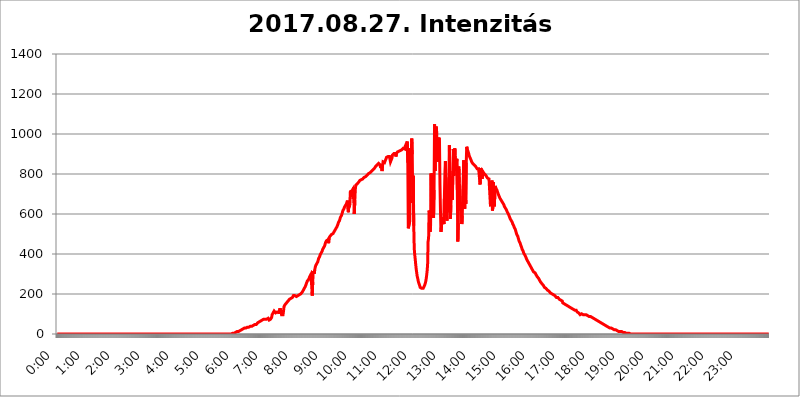
| Category | 2017.08.27. Intenzitás [W/m^2] |
|---|---|
| 0.0 | 0 |
| 0.0006944444444444445 | 0 |
| 0.001388888888888889 | 0 |
| 0.0020833333333333333 | 0 |
| 0.002777777777777778 | 0 |
| 0.003472222222222222 | 0 |
| 0.004166666666666667 | 0 |
| 0.004861111111111111 | 0 |
| 0.005555555555555556 | 0 |
| 0.0062499999999999995 | 0 |
| 0.006944444444444444 | 0 |
| 0.007638888888888889 | 0 |
| 0.008333333333333333 | 0 |
| 0.009027777777777779 | 0 |
| 0.009722222222222222 | 0 |
| 0.010416666666666666 | 0 |
| 0.011111111111111112 | 0 |
| 0.011805555555555555 | 0 |
| 0.012499999999999999 | 0 |
| 0.013194444444444444 | 0 |
| 0.013888888888888888 | 0 |
| 0.014583333333333332 | 0 |
| 0.015277777777777777 | 0 |
| 0.015972222222222224 | 0 |
| 0.016666666666666666 | 0 |
| 0.017361111111111112 | 0 |
| 0.018055555555555557 | 0 |
| 0.01875 | 0 |
| 0.019444444444444445 | 0 |
| 0.02013888888888889 | 0 |
| 0.020833333333333332 | 0 |
| 0.02152777777777778 | 0 |
| 0.022222222222222223 | 0 |
| 0.02291666666666667 | 0 |
| 0.02361111111111111 | 0 |
| 0.024305555555555556 | 0 |
| 0.024999999999999998 | 0 |
| 0.025694444444444447 | 0 |
| 0.02638888888888889 | 0 |
| 0.027083333333333334 | 0 |
| 0.027777777777777776 | 0 |
| 0.02847222222222222 | 0 |
| 0.029166666666666664 | 0 |
| 0.029861111111111113 | 0 |
| 0.030555555555555555 | 0 |
| 0.03125 | 0 |
| 0.03194444444444445 | 0 |
| 0.03263888888888889 | 0 |
| 0.03333333333333333 | 0 |
| 0.034027777777777775 | 0 |
| 0.034722222222222224 | 0 |
| 0.035416666666666666 | 0 |
| 0.036111111111111115 | 0 |
| 0.03680555555555556 | 0 |
| 0.0375 | 0 |
| 0.03819444444444444 | 0 |
| 0.03888888888888889 | 0 |
| 0.03958333333333333 | 0 |
| 0.04027777777777778 | 0 |
| 0.04097222222222222 | 0 |
| 0.041666666666666664 | 0 |
| 0.042361111111111106 | 0 |
| 0.04305555555555556 | 0 |
| 0.043750000000000004 | 0 |
| 0.044444444444444446 | 0 |
| 0.04513888888888889 | 0 |
| 0.04583333333333334 | 0 |
| 0.04652777777777778 | 0 |
| 0.04722222222222222 | 0 |
| 0.04791666666666666 | 0 |
| 0.04861111111111111 | 0 |
| 0.049305555555555554 | 0 |
| 0.049999999999999996 | 0 |
| 0.05069444444444445 | 0 |
| 0.051388888888888894 | 0 |
| 0.052083333333333336 | 0 |
| 0.05277777777777778 | 0 |
| 0.05347222222222222 | 0 |
| 0.05416666666666667 | 0 |
| 0.05486111111111111 | 0 |
| 0.05555555555555555 | 0 |
| 0.05625 | 0 |
| 0.05694444444444444 | 0 |
| 0.057638888888888885 | 0 |
| 0.05833333333333333 | 0 |
| 0.05902777777777778 | 0 |
| 0.059722222222222225 | 0 |
| 0.06041666666666667 | 0 |
| 0.061111111111111116 | 0 |
| 0.06180555555555556 | 0 |
| 0.0625 | 0 |
| 0.06319444444444444 | 0 |
| 0.06388888888888888 | 0 |
| 0.06458333333333334 | 0 |
| 0.06527777777777778 | 0 |
| 0.06597222222222222 | 0 |
| 0.06666666666666667 | 0 |
| 0.06736111111111111 | 0 |
| 0.06805555555555555 | 0 |
| 0.06874999999999999 | 0 |
| 0.06944444444444443 | 0 |
| 0.07013888888888889 | 0 |
| 0.07083333333333333 | 0 |
| 0.07152777777777779 | 0 |
| 0.07222222222222223 | 0 |
| 0.07291666666666667 | 0 |
| 0.07361111111111111 | 0 |
| 0.07430555555555556 | 0 |
| 0.075 | 0 |
| 0.07569444444444444 | 0 |
| 0.0763888888888889 | 0 |
| 0.07708333333333334 | 0 |
| 0.07777777777777778 | 0 |
| 0.07847222222222222 | 0 |
| 0.07916666666666666 | 0 |
| 0.0798611111111111 | 0 |
| 0.08055555555555556 | 0 |
| 0.08125 | 0 |
| 0.08194444444444444 | 0 |
| 0.08263888888888889 | 0 |
| 0.08333333333333333 | 0 |
| 0.08402777777777777 | 0 |
| 0.08472222222222221 | 0 |
| 0.08541666666666665 | 0 |
| 0.08611111111111112 | 0 |
| 0.08680555555555557 | 0 |
| 0.08750000000000001 | 0 |
| 0.08819444444444445 | 0 |
| 0.08888888888888889 | 0 |
| 0.08958333333333333 | 0 |
| 0.09027777777777778 | 0 |
| 0.09097222222222222 | 0 |
| 0.09166666666666667 | 0 |
| 0.09236111111111112 | 0 |
| 0.09305555555555556 | 0 |
| 0.09375 | 0 |
| 0.09444444444444444 | 0 |
| 0.09513888888888888 | 0 |
| 0.09583333333333333 | 0 |
| 0.09652777777777777 | 0 |
| 0.09722222222222222 | 0 |
| 0.09791666666666667 | 0 |
| 0.09861111111111111 | 0 |
| 0.09930555555555555 | 0 |
| 0.09999999999999999 | 0 |
| 0.10069444444444443 | 0 |
| 0.1013888888888889 | 0 |
| 0.10208333333333335 | 0 |
| 0.10277777777777779 | 0 |
| 0.10347222222222223 | 0 |
| 0.10416666666666667 | 0 |
| 0.10486111111111111 | 0 |
| 0.10555555555555556 | 0 |
| 0.10625 | 0 |
| 0.10694444444444444 | 0 |
| 0.1076388888888889 | 0 |
| 0.10833333333333334 | 0 |
| 0.10902777777777778 | 0 |
| 0.10972222222222222 | 0 |
| 0.1111111111111111 | 0 |
| 0.11180555555555556 | 0 |
| 0.11180555555555556 | 0 |
| 0.1125 | 0 |
| 0.11319444444444444 | 0 |
| 0.11388888888888889 | 0 |
| 0.11458333333333333 | 0 |
| 0.11527777777777777 | 0 |
| 0.11597222222222221 | 0 |
| 0.11666666666666665 | 0 |
| 0.1173611111111111 | 0 |
| 0.11805555555555557 | 0 |
| 0.11944444444444445 | 0 |
| 0.12013888888888889 | 0 |
| 0.12083333333333333 | 0 |
| 0.12152777777777778 | 0 |
| 0.12222222222222223 | 0 |
| 0.12291666666666667 | 0 |
| 0.12291666666666667 | 0 |
| 0.12361111111111112 | 0 |
| 0.12430555555555556 | 0 |
| 0.125 | 0 |
| 0.12569444444444444 | 0 |
| 0.12638888888888888 | 0 |
| 0.12708333333333333 | 0 |
| 0.16875 | 0 |
| 0.12847222222222224 | 0 |
| 0.12916666666666668 | 0 |
| 0.12986111111111112 | 0 |
| 0.13055555555555556 | 0 |
| 0.13125 | 0 |
| 0.13194444444444445 | 0 |
| 0.1326388888888889 | 0 |
| 0.13333333333333333 | 0 |
| 0.13402777777777777 | 0 |
| 0.13402777777777777 | 0 |
| 0.13472222222222222 | 0 |
| 0.13541666666666666 | 0 |
| 0.1361111111111111 | 0 |
| 0.13749999999999998 | 0 |
| 0.13819444444444443 | 0 |
| 0.1388888888888889 | 0 |
| 0.13958333333333334 | 0 |
| 0.14027777777777778 | 0 |
| 0.14097222222222222 | 0 |
| 0.14166666666666666 | 0 |
| 0.1423611111111111 | 0 |
| 0.14305555555555557 | 0 |
| 0.14375000000000002 | 0 |
| 0.14444444444444446 | 0 |
| 0.1451388888888889 | 0 |
| 0.1451388888888889 | 0 |
| 0.14652777777777778 | 0 |
| 0.14722222222222223 | 0 |
| 0.14791666666666667 | 0 |
| 0.1486111111111111 | 0 |
| 0.14930555555555555 | 0 |
| 0.15 | 0 |
| 0.15069444444444444 | 0 |
| 0.15138888888888888 | 0 |
| 0.15208333333333332 | 0 |
| 0.15277777777777776 | 0 |
| 0.15347222222222223 | 0 |
| 0.15416666666666667 | 0 |
| 0.15486111111111112 | 0 |
| 0.15555555555555556 | 0 |
| 0.15625 | 0 |
| 0.15694444444444444 | 0 |
| 0.15763888888888888 | 0 |
| 0.15833333333333333 | 0 |
| 0.15902777777777777 | 0 |
| 0.15972222222222224 | 0 |
| 0.16041666666666668 | 0 |
| 0.16111111111111112 | 0 |
| 0.16180555555555556 | 0 |
| 0.1625 | 0 |
| 0.16319444444444445 | 0 |
| 0.1638888888888889 | 0 |
| 0.16458333333333333 | 0 |
| 0.16527777777777777 | 0 |
| 0.16597222222222222 | 0 |
| 0.16666666666666666 | 0 |
| 0.1673611111111111 | 0 |
| 0.16805555555555554 | 0 |
| 0.16874999999999998 | 0 |
| 0.16944444444444443 | 0 |
| 0.17013888888888887 | 0 |
| 0.1708333333333333 | 0 |
| 0.17152777777777775 | 0 |
| 0.17222222222222225 | 0 |
| 0.1729166666666667 | 0 |
| 0.17361111111111113 | 0 |
| 0.17430555555555557 | 0 |
| 0.17500000000000002 | 0 |
| 0.17569444444444446 | 0 |
| 0.1763888888888889 | 0 |
| 0.17708333333333334 | 0 |
| 0.17777777777777778 | 0 |
| 0.17847222222222223 | 0 |
| 0.17916666666666667 | 0 |
| 0.1798611111111111 | 0 |
| 0.18055555555555555 | 0 |
| 0.18125 | 0 |
| 0.18194444444444444 | 0 |
| 0.1826388888888889 | 0 |
| 0.18333333333333335 | 0 |
| 0.1840277777777778 | 0 |
| 0.18472222222222223 | 0 |
| 0.18541666666666667 | 0 |
| 0.18611111111111112 | 0 |
| 0.18680555555555556 | 0 |
| 0.1875 | 0 |
| 0.18819444444444444 | 0 |
| 0.18888888888888888 | 0 |
| 0.18958333333333333 | 0 |
| 0.19027777777777777 | 0 |
| 0.1909722222222222 | 0 |
| 0.19166666666666665 | 0 |
| 0.19236111111111112 | 0 |
| 0.19305555555555554 | 0 |
| 0.19375 | 0 |
| 0.19444444444444445 | 0 |
| 0.1951388888888889 | 0 |
| 0.19583333333333333 | 0 |
| 0.19652777777777777 | 0 |
| 0.19722222222222222 | 0 |
| 0.19791666666666666 | 0 |
| 0.1986111111111111 | 0 |
| 0.19930555555555554 | 0 |
| 0.19999999999999998 | 0 |
| 0.20069444444444443 | 0 |
| 0.20138888888888887 | 0 |
| 0.2020833333333333 | 0 |
| 0.2027777777777778 | 0 |
| 0.2034722222222222 | 0 |
| 0.2041666666666667 | 0 |
| 0.20486111111111113 | 0 |
| 0.20555555555555557 | 0 |
| 0.20625000000000002 | 0 |
| 0.20694444444444446 | 0 |
| 0.2076388888888889 | 0 |
| 0.20833333333333334 | 0 |
| 0.20902777777777778 | 0 |
| 0.20972222222222223 | 0 |
| 0.21041666666666667 | 0 |
| 0.2111111111111111 | 0 |
| 0.21180555555555555 | 0 |
| 0.2125 | 0 |
| 0.21319444444444444 | 0 |
| 0.2138888888888889 | 0 |
| 0.21458333333333335 | 0 |
| 0.2152777777777778 | 0 |
| 0.21597222222222223 | 0 |
| 0.21666666666666667 | 0 |
| 0.21736111111111112 | 0 |
| 0.21805555555555556 | 0 |
| 0.21875 | 0 |
| 0.21944444444444444 | 0 |
| 0.22013888888888888 | 0 |
| 0.22083333333333333 | 0 |
| 0.22152777777777777 | 0 |
| 0.2222222222222222 | 0 |
| 0.22291666666666665 | 0 |
| 0.2236111111111111 | 0 |
| 0.22430555555555556 | 0 |
| 0.225 | 0 |
| 0.22569444444444445 | 0 |
| 0.2263888888888889 | 0 |
| 0.22708333333333333 | 0 |
| 0.22777777777777777 | 0 |
| 0.22847222222222222 | 0 |
| 0.22916666666666666 | 0 |
| 0.2298611111111111 | 0 |
| 0.23055555555555554 | 0 |
| 0.23124999999999998 | 0 |
| 0.23194444444444443 | 0 |
| 0.23263888888888887 | 0 |
| 0.2333333333333333 | 0 |
| 0.2340277777777778 | 0 |
| 0.2347222222222222 | 0 |
| 0.2354166666666667 | 0 |
| 0.23611111111111113 | 0 |
| 0.23680555555555557 | 0 |
| 0.23750000000000002 | 0 |
| 0.23819444444444446 | 0 |
| 0.2388888888888889 | 0 |
| 0.23958333333333334 | 0 |
| 0.24027777777777778 | 0 |
| 0.24097222222222223 | 0 |
| 0.24166666666666667 | 0 |
| 0.2423611111111111 | 0 |
| 0.24305555555555555 | 0 |
| 0.24375 | 0 |
| 0.24444444444444446 | 0 |
| 0.24513888888888888 | 0 |
| 0.24583333333333335 | 3.525 |
| 0.2465277777777778 | 3.525 |
| 0.24722222222222223 | 3.525 |
| 0.24791666666666667 | 3.525 |
| 0.24861111111111112 | 3.525 |
| 0.24930555555555556 | 3.525 |
| 0.25 | 7.887 |
| 0.25069444444444444 | 7.887 |
| 0.2513888888888889 | 7.887 |
| 0.2520833333333333 | 12.257 |
| 0.25277777777777777 | 12.257 |
| 0.2534722222222222 | 12.257 |
| 0.25416666666666665 | 12.257 |
| 0.2548611111111111 | 12.257 |
| 0.2555555555555556 | 16.636 |
| 0.25625000000000003 | 16.636 |
| 0.2569444444444445 | 16.636 |
| 0.2576388888888889 | 21.024 |
| 0.25833333333333336 | 21.024 |
| 0.2590277777777778 | 21.024 |
| 0.25972222222222224 | 21.024 |
| 0.2604166666666667 | 25.419 |
| 0.2611111111111111 | 25.419 |
| 0.26180555555555557 | 25.419 |
| 0.2625 | 29.823 |
| 0.26319444444444445 | 29.823 |
| 0.2638888888888889 | 29.823 |
| 0.26458333333333334 | 29.823 |
| 0.2652777777777778 | 29.823 |
| 0.2659722222222222 | 34.234 |
| 0.26666666666666666 | 34.234 |
| 0.2673611111111111 | 34.234 |
| 0.26805555555555555 | 34.234 |
| 0.26875 | 34.234 |
| 0.26944444444444443 | 34.234 |
| 0.2701388888888889 | 34.234 |
| 0.2708333333333333 | 38.653 |
| 0.27152777777777776 | 38.653 |
| 0.2722222222222222 | 38.653 |
| 0.27291666666666664 | 38.653 |
| 0.2736111111111111 | 38.653 |
| 0.2743055555555555 | 38.653 |
| 0.27499999999999997 | 43.079 |
| 0.27569444444444446 | 43.079 |
| 0.27638888888888885 | 47.511 |
| 0.27708333333333335 | 47.511 |
| 0.2777777777777778 | 47.511 |
| 0.27847222222222223 | 47.511 |
| 0.2791666666666667 | 47.511 |
| 0.2798611111111111 | 51.951 |
| 0.28055555555555556 | 51.951 |
| 0.28125 | 56.398 |
| 0.28194444444444444 | 56.398 |
| 0.2826388888888889 | 56.398 |
| 0.2833333333333333 | 60.85 |
| 0.28402777777777777 | 60.85 |
| 0.2847222222222222 | 65.31 |
| 0.28541666666666665 | 65.31 |
| 0.28611111111111115 | 65.31 |
| 0.28680555555555554 | 69.775 |
| 0.28750000000000003 | 69.775 |
| 0.2881944444444445 | 69.775 |
| 0.2888888888888889 | 74.246 |
| 0.28958333333333336 | 74.246 |
| 0.2902777777777778 | 74.246 |
| 0.29097222222222224 | 74.246 |
| 0.2916666666666667 | 74.246 |
| 0.2923611111111111 | 74.246 |
| 0.29305555555555557 | 74.246 |
| 0.29375 | 74.246 |
| 0.29444444444444445 | 78.722 |
| 0.2951388888888889 | 78.722 |
| 0.29583333333333334 | 78.722 |
| 0.2965277777777778 | 74.246 |
| 0.2972222222222222 | 69.775 |
| 0.29791666666666666 | 74.246 |
| 0.2986111111111111 | 74.246 |
| 0.29930555555555555 | 74.246 |
| 0.3 | 78.722 |
| 0.30069444444444443 | 83.205 |
| 0.3013888888888889 | 96.682 |
| 0.3020833333333333 | 101.184 |
| 0.30277777777777776 | 105.69 |
| 0.3034722222222222 | 110.201 |
| 0.30416666666666664 | 114.716 |
| 0.3048611111111111 | 114.716 |
| 0.3055555555555555 | 114.716 |
| 0.30624999999999997 | 105.69 |
| 0.3069444444444444 | 105.69 |
| 0.3076388888888889 | 105.69 |
| 0.30833333333333335 | 110.201 |
| 0.3090277777777778 | 114.716 |
| 0.30972222222222223 | 110.201 |
| 0.3104166666666667 | 110.201 |
| 0.3111111111111111 | 101.184 |
| 0.31180555555555556 | 101.184 |
| 0.3125 | 128.284 |
| 0.31319444444444444 | 123.758 |
| 0.3138888888888889 | 110.201 |
| 0.3145833333333333 | 96.682 |
| 0.31527777777777777 | 101.184 |
| 0.3159722222222222 | 96.682 |
| 0.31666666666666665 | 96.682 |
| 0.31736111111111115 | 114.716 |
| 0.31805555555555554 | 137.347 |
| 0.31875000000000003 | 141.884 |
| 0.3194444444444445 | 146.423 |
| 0.3201388888888889 | 146.423 |
| 0.32083333333333336 | 150.964 |
| 0.3215277777777778 | 155.509 |
| 0.32222222222222224 | 155.509 |
| 0.3229166666666667 | 160.056 |
| 0.3236111111111111 | 164.605 |
| 0.32430555555555557 | 164.605 |
| 0.325 | 164.605 |
| 0.32569444444444445 | 173.709 |
| 0.3263888888888889 | 173.709 |
| 0.32708333333333334 | 178.264 |
| 0.3277777777777778 | 178.264 |
| 0.3284722222222222 | 178.264 |
| 0.32916666666666666 | 182.82 |
| 0.3298611111111111 | 182.82 |
| 0.33055555555555555 | 187.378 |
| 0.33125 | 191.937 |
| 0.33194444444444443 | 191.937 |
| 0.3326388888888889 | 191.937 |
| 0.3333333333333333 | 191.937 |
| 0.3340277777777778 | 191.937 |
| 0.3347222222222222 | 187.378 |
| 0.3354166666666667 | 187.378 |
| 0.3361111111111111 | 187.378 |
| 0.3368055555555556 | 187.378 |
| 0.33749999999999997 | 191.937 |
| 0.33819444444444446 | 196.497 |
| 0.33888888888888885 | 196.497 |
| 0.33958333333333335 | 196.497 |
| 0.34027777777777773 | 196.497 |
| 0.34097222222222223 | 196.497 |
| 0.3416666666666666 | 201.058 |
| 0.3423611111111111 | 201.058 |
| 0.3430555555555555 | 205.62 |
| 0.34375 | 210.182 |
| 0.3444444444444445 | 210.182 |
| 0.3451388888888889 | 219.309 |
| 0.3458333333333334 | 223.873 |
| 0.34652777777777777 | 228.436 |
| 0.34722222222222227 | 233 |
| 0.34791666666666665 | 237.564 |
| 0.34861111111111115 | 242.127 |
| 0.34930555555555554 | 251.251 |
| 0.35000000000000003 | 255.813 |
| 0.3506944444444444 | 264.932 |
| 0.3513888888888889 | 269.49 |
| 0.3520833333333333 | 269.49 |
| 0.3527777777777778 | 274.047 |
| 0.3534722222222222 | 278.603 |
| 0.3541666666666667 | 287.709 |
| 0.3548611111111111 | 292.259 |
| 0.35555555555555557 | 296.808 |
| 0.35625 | 292.259 |
| 0.35694444444444445 | 237.564 |
| 0.3576388888888889 | 191.937 |
| 0.35833333333333334 | 260.373 |
| 0.3590277777777778 | 314.98 |
| 0.3597222222222222 | 310.44 |
| 0.36041666666666666 | 301.354 |
| 0.3611111111111111 | 319.517 |
| 0.36180555555555555 | 333.113 |
| 0.3625 | 342.162 |
| 0.36319444444444443 | 346.682 |
| 0.3638888888888889 | 351.198 |
| 0.3645833333333333 | 355.712 |
| 0.3652777777777778 | 360.221 |
| 0.3659722222222222 | 369.23 |
| 0.3666666666666667 | 378.224 |
| 0.3673611111111111 | 378.224 |
| 0.3680555555555556 | 387.202 |
| 0.36874999999999997 | 396.164 |
| 0.36944444444444446 | 396.164 |
| 0.37013888888888885 | 405.108 |
| 0.37083333333333335 | 409.574 |
| 0.37152777777777773 | 414.035 |
| 0.37222222222222223 | 422.943 |
| 0.3729166666666666 | 427.39 |
| 0.3736111111111111 | 431.833 |
| 0.3743055555555555 | 436.27 |
| 0.375 | 440.702 |
| 0.3756944444444445 | 449.551 |
| 0.3763888888888889 | 458.38 |
| 0.3770833333333334 | 462.786 |
| 0.37777777777777777 | 467.187 |
| 0.37847222222222227 | 471.582 |
| 0.37916666666666665 | 471.582 |
| 0.37986111111111115 | 471.582 |
| 0.38055555555555554 | 453.968 |
| 0.38125000000000003 | 480.356 |
| 0.3819444444444444 | 484.735 |
| 0.3826388888888889 | 489.108 |
| 0.3833333333333333 | 489.108 |
| 0.3840277777777778 | 493.475 |
| 0.3847222222222222 | 497.836 |
| 0.3854166666666667 | 497.836 |
| 0.3861111111111111 | 502.192 |
| 0.38680555555555557 | 502.192 |
| 0.3875 | 506.542 |
| 0.38819444444444445 | 510.885 |
| 0.3888888888888889 | 515.223 |
| 0.38958333333333334 | 519.555 |
| 0.3902777777777778 | 523.88 |
| 0.3909722222222222 | 528.2 |
| 0.39166666666666666 | 532.513 |
| 0.3923611111111111 | 536.82 |
| 0.39305555555555555 | 541.121 |
| 0.39375 | 549.704 |
| 0.39444444444444443 | 558.261 |
| 0.3951388888888889 | 562.53 |
| 0.3958333333333333 | 566.793 |
| 0.3965277777777778 | 575.299 |
| 0.3972222222222222 | 583.779 |
| 0.3979166666666667 | 588.009 |
| 0.3986111111111111 | 592.233 |
| 0.3993055555555556 | 600.661 |
| 0.39999999999999997 | 609.062 |
| 0.40069444444444446 | 617.436 |
| 0.40138888888888885 | 621.613 |
| 0.40208333333333335 | 625.784 |
| 0.40277777777777773 | 634.105 |
| 0.40347222222222223 | 638.256 |
| 0.4041666666666666 | 642.4 |
| 0.4048611111111111 | 642.4 |
| 0.4055555555555555 | 650.667 |
| 0.40625 | 654.791 |
| 0.4069444444444445 | 667.123 |
| 0.4076388888888889 | 671.22 |
| 0.4083333333333334 | 609.062 |
| 0.40902777777777777 | 646.537 |
| 0.40972222222222227 | 634.105 |
| 0.41041666666666665 | 654.791 |
| 0.41111111111111115 | 711.832 |
| 0.41180555555555554 | 711.832 |
| 0.41250000000000003 | 715.858 |
| 0.4131944444444444 | 715.858 |
| 0.4138888888888889 | 719.877 |
| 0.4145833333333333 | 723.889 |
| 0.4152777777777778 | 675.311 |
| 0.4159722222222222 | 731.896 |
| 0.4166666666666667 | 600.661 |
| 0.4173611111111111 | 671.22 |
| 0.41805555555555557 | 723.889 |
| 0.41875 | 743.859 |
| 0.41944444444444445 | 743.859 |
| 0.4201388888888889 | 747.834 |
| 0.42083333333333334 | 751.803 |
| 0.4215277777777778 | 755.766 |
| 0.4222222222222222 | 755.766 |
| 0.42291666666666666 | 759.723 |
| 0.4236111111111111 | 763.674 |
| 0.42430555555555555 | 767.62 |
| 0.425 | 771.559 |
| 0.42569444444444443 | 771.559 |
| 0.4263888888888889 | 771.559 |
| 0.4270833333333333 | 775.492 |
| 0.4277777777777778 | 775.492 |
| 0.4284722222222222 | 775.492 |
| 0.4291666666666667 | 779.42 |
| 0.4298611111111111 | 779.42 |
| 0.4305555555555556 | 783.342 |
| 0.43124999999999997 | 783.342 |
| 0.43194444444444446 | 787.258 |
| 0.43263888888888885 | 787.258 |
| 0.43333333333333335 | 791.169 |
| 0.43402777777777773 | 791.169 |
| 0.43472222222222223 | 795.074 |
| 0.4354166666666666 | 798.974 |
| 0.4361111111111111 | 798.974 |
| 0.4368055555555555 | 802.868 |
| 0.4375 | 806.757 |
| 0.4381944444444445 | 806.757 |
| 0.4388888888888889 | 806.757 |
| 0.4395833333333334 | 810.641 |
| 0.44027777777777777 | 810.641 |
| 0.44097222222222227 | 814.519 |
| 0.44166666666666665 | 818.392 |
| 0.44236111111111115 | 818.392 |
| 0.44305555555555554 | 822.26 |
| 0.44375000000000003 | 826.123 |
| 0.4444444444444444 | 826.123 |
| 0.4451388888888889 | 829.981 |
| 0.4458333333333333 | 833.834 |
| 0.4465277777777778 | 837.682 |
| 0.4472222222222222 | 841.526 |
| 0.4479166666666667 | 841.526 |
| 0.4486111111111111 | 845.365 |
| 0.44930555555555557 | 845.365 |
| 0.45 | 849.199 |
| 0.45069444444444445 | 853.029 |
| 0.4513888888888889 | 853.029 |
| 0.45208333333333334 | 853.029 |
| 0.4527777777777778 | 845.365 |
| 0.4534722222222222 | 829.981 |
| 0.45416666666666666 | 849.199 |
| 0.4548611111111111 | 829.981 |
| 0.45555555555555555 | 814.519 |
| 0.45625 | 841.526 |
| 0.45694444444444443 | 860.676 |
| 0.4576388888888889 | 860.676 |
| 0.4583333333333333 | 864.493 |
| 0.4590277777777778 | 856.855 |
| 0.4597222222222222 | 864.493 |
| 0.4604166666666667 | 868.305 |
| 0.4611111111111111 | 875.918 |
| 0.4618055555555556 | 883.516 |
| 0.46249999999999997 | 883.516 |
| 0.46319444444444446 | 887.309 |
| 0.46388888888888885 | 887.309 |
| 0.46458333333333335 | 887.309 |
| 0.46527777777777773 | 887.309 |
| 0.46597222222222223 | 887.309 |
| 0.4666666666666666 | 891.099 |
| 0.4673611111111111 | 860.676 |
| 0.4680555555555555 | 860.676 |
| 0.46875 | 860.676 |
| 0.4694444444444445 | 879.719 |
| 0.4701388888888889 | 894.885 |
| 0.4708333333333334 | 894.885 |
| 0.47152777777777777 | 898.668 |
| 0.47222222222222227 | 902.447 |
| 0.47291666666666665 | 902.447 |
| 0.47361111111111115 | 902.447 |
| 0.47430555555555554 | 902.447 |
| 0.47500000000000003 | 887.309 |
| 0.4756944444444444 | 902.447 |
| 0.4763888888888889 | 906.223 |
| 0.4770833333333333 | 909.996 |
| 0.4777777777777778 | 909.996 |
| 0.4784722222222222 | 909.996 |
| 0.4791666666666667 | 913.766 |
| 0.4798611111111111 | 917.534 |
| 0.48055555555555557 | 917.534 |
| 0.48125 | 917.534 |
| 0.48194444444444445 | 921.298 |
| 0.4826388888888889 | 921.298 |
| 0.48333333333333334 | 921.298 |
| 0.4840277777777778 | 925.06 |
| 0.4847222222222222 | 917.534 |
| 0.48541666666666666 | 928.819 |
| 0.4861111111111111 | 928.819 |
| 0.48680555555555555 | 925.06 |
| 0.4875 | 925.06 |
| 0.48819444444444443 | 940.082 |
| 0.4888888888888889 | 943.832 |
| 0.4895833333333333 | 951.327 |
| 0.4902777777777778 | 947.58 |
| 0.4909722222222222 | 962.555 |
| 0.4916666666666667 | 856.855 |
| 0.4923611111111111 | 528.2 |
| 0.4930555555555556 | 528.2 |
| 0.49374999999999997 | 528.2 |
| 0.49444444444444446 | 566.793 |
| 0.49513888888888885 | 928.819 |
| 0.49583333333333335 | 860.676 |
| 0.49652777777777773 | 883.516 |
| 0.49722222222222223 | 977.508 |
| 0.4979166666666666 | 898.668 |
| 0.4986111111111111 | 654.791 |
| 0.4993055555555555 | 791.169 |
| 0.5 | 541.121 |
| 0.5006944444444444 | 427.39 |
| 0.5013888888888889 | 396.164 |
| 0.5020833333333333 | 373.729 |
| 0.5027777777777778 | 346.682 |
| 0.5034722222222222 | 324.052 |
| 0.5041666666666667 | 305.898 |
| 0.5048611111111111 | 287.709 |
| 0.5055555555555555 | 278.603 |
| 0.50625 | 264.932 |
| 0.5069444444444444 | 255.813 |
| 0.5076388888888889 | 251.251 |
| 0.5083333333333333 | 242.127 |
| 0.5090277777777777 | 233 |
| 0.5097222222222222 | 233 |
| 0.5104166666666666 | 228.436 |
| 0.5111111111111112 | 228.436 |
| 0.5118055555555555 | 228.436 |
| 0.5125000000000001 | 228.436 |
| 0.5131944444444444 | 228.436 |
| 0.513888888888889 | 233 |
| 0.5145833333333333 | 237.564 |
| 0.5152777777777778 | 242.127 |
| 0.5159722222222222 | 251.251 |
| 0.5166666666666667 | 260.373 |
| 0.517361111111111 | 274.047 |
| 0.5180555555555556 | 292.259 |
| 0.5187499999999999 | 314.98 |
| 0.5194444444444445 | 346.682 |
| 0.5201388888888888 | 462.786 |
| 0.5208333333333334 | 480.356 |
| 0.5215277777777778 | 617.436 |
| 0.5222222222222223 | 609.062 |
| 0.5229166666666667 | 510.885 |
| 0.5236111111111111 | 541.121 |
| 0.5243055555555556 | 802.868 |
| 0.525 | 600.661 |
| 0.5256944444444445 | 683.473 |
| 0.5263888888888889 | 802.868 |
| 0.5270833333333333 | 715.858 |
| 0.5277777777777778 | 579.542 |
| 0.5284722222222222 | 719.877 |
| 0.5291666666666667 | 1048.508 |
| 0.5298611111111111 | 814.519 |
| 0.5305555555555556 | 1022.323 |
| 0.53125 | 1037.277 |
| 0.5319444444444444 | 1026.06 |
| 0.5326388888888889 | 966.295 |
| 0.5333333333333333 | 860.676 |
| 0.5340277777777778 | 981.244 |
| 0.5347222222222222 | 955.071 |
| 0.5354166666666667 | 981.244 |
| 0.5361111111111111 | 955.071 |
| 0.5368055555555555 | 743.859 |
| 0.5375 | 613.252 |
| 0.5381944444444444 | 510.885 |
| 0.5388888888888889 | 536.82 |
| 0.5395833333333333 | 575.299 |
| 0.5402777777777777 | 583.779 |
| 0.5409722222222222 | 549.704 |
| 0.5416666666666666 | 562.53 |
| 0.5423611111111112 | 549.704 |
| 0.5430555555555555 | 695.666 |
| 0.5437500000000001 | 810.641 |
| 0.5444444444444444 | 864.493 |
| 0.545138888888889 | 667.123 |
| 0.5458333333333333 | 600.661 |
| 0.5465277777777778 | 566.793 |
| 0.5472222222222222 | 687.544 |
| 0.5479166666666667 | 609.062 |
| 0.548611111111111 | 604.864 |
| 0.5493055555555556 | 783.342 |
| 0.5499999999999999 | 943.832 |
| 0.5506944444444445 | 739.877 |
| 0.5513888888888888 | 575.299 |
| 0.5520833333333334 | 642.4 |
| 0.5527777777777778 | 707.8 |
| 0.5534722222222223 | 787.258 |
| 0.5541666666666667 | 671.22 |
| 0.5548611111111111 | 814.519 |
| 0.5555555555555556 | 925.06 |
| 0.55625 | 791.169 |
| 0.5569444444444445 | 853.029 |
| 0.5576388888888889 | 928.819 |
| 0.5583333333333333 | 860.676 |
| 0.5590277777777778 | 814.519 |
| 0.5597222222222222 | 810.641 |
| 0.5604166666666667 | 875.918 |
| 0.5611111111111111 | 719.877 |
| 0.5618055555555556 | 462.786 |
| 0.5625 | 553.986 |
| 0.5631944444444444 | 837.682 |
| 0.5638888888888889 | 755.766 |
| 0.5645833333333333 | 735.89 |
| 0.5652777777777778 | 667.123 |
| 0.5659722222222222 | 617.436 |
| 0.5666666666666667 | 654.791 |
| 0.5673611111111111 | 549.704 |
| 0.5680555555555555 | 592.233 |
| 0.56875 | 687.544 |
| 0.5694444444444444 | 683.473 |
| 0.5701388888888889 | 868.305 |
| 0.5708333333333333 | 703.762 |
| 0.5715277777777777 | 625.784 |
| 0.5722222222222222 | 739.877 |
| 0.5729166666666666 | 650.667 |
| 0.5736111111111112 | 856.855 |
| 0.5743055555555555 | 936.33 |
| 0.5750000000000001 | 925.06 |
| 0.5756944444444444 | 917.534 |
| 0.576388888888889 | 909.996 |
| 0.5770833333333333 | 902.447 |
| 0.5777777777777778 | 891.099 |
| 0.5784722222222222 | 887.309 |
| 0.5791666666666667 | 879.719 |
| 0.579861111111111 | 875.918 |
| 0.5805555555555556 | 868.305 |
| 0.5812499999999999 | 860.676 |
| 0.5819444444444445 | 856.855 |
| 0.5826388888888888 | 853.029 |
| 0.5833333333333334 | 853.029 |
| 0.5840277777777778 | 849.199 |
| 0.5847222222222223 | 845.365 |
| 0.5854166666666667 | 845.365 |
| 0.5861111111111111 | 841.526 |
| 0.5868055555555556 | 837.682 |
| 0.5875 | 837.682 |
| 0.5881944444444445 | 837.682 |
| 0.5888888888888889 | 826.123 |
| 0.5895833333333333 | 829.981 |
| 0.5902777777777778 | 829.981 |
| 0.5909722222222222 | 826.123 |
| 0.5916666666666667 | 826.123 |
| 0.5923611111111111 | 822.26 |
| 0.5930555555555556 | 747.834 |
| 0.59375 | 829.981 |
| 0.5944444444444444 | 822.26 |
| 0.5951388888888889 | 806.757 |
| 0.5958333333333333 | 775.492 |
| 0.5965277777777778 | 779.42 |
| 0.5972222222222222 | 810.641 |
| 0.5979166666666667 | 806.757 |
| 0.5986111111111111 | 802.868 |
| 0.5993055555555555 | 802.868 |
| 0.6 | 798.974 |
| 0.6006944444444444 | 795.074 |
| 0.6013888888888889 | 791.169 |
| 0.6020833333333333 | 787.258 |
| 0.6027777777777777 | 783.342 |
| 0.6034722222222222 | 779.42 |
| 0.6041666666666666 | 775.492 |
| 0.6048611111111112 | 775.492 |
| 0.6055555555555555 | 775.492 |
| 0.6062500000000001 | 771.559 |
| 0.6069444444444444 | 771.559 |
| 0.607638888888889 | 638.256 |
| 0.6083333333333333 | 687.544 |
| 0.6090277777777778 | 739.877 |
| 0.6097222222222222 | 767.62 |
| 0.6104166666666667 | 617.436 |
| 0.611111111111111 | 638.256 |
| 0.6118055555555556 | 759.723 |
| 0.6124999999999999 | 755.766 |
| 0.6131944444444445 | 638.256 |
| 0.6138888888888888 | 739.877 |
| 0.6145833333333334 | 735.89 |
| 0.6152777777777778 | 727.896 |
| 0.6159722222222223 | 723.889 |
| 0.6166666666666667 | 719.877 |
| 0.6173611111111111 | 711.832 |
| 0.6180555555555556 | 703.762 |
| 0.61875 | 699.717 |
| 0.6194444444444445 | 691.608 |
| 0.6201388888888889 | 687.544 |
| 0.6208333333333333 | 679.395 |
| 0.6215277777777778 | 675.311 |
| 0.6222222222222222 | 671.22 |
| 0.6229166666666667 | 667.123 |
| 0.6236111111111111 | 663.019 |
| 0.6243055555555556 | 658.909 |
| 0.625 | 654.791 |
| 0.6256944444444444 | 654.791 |
| 0.6263888888888889 | 646.537 |
| 0.6270833333333333 | 638.256 |
| 0.6277777777777778 | 634.105 |
| 0.6284722222222222 | 629.948 |
| 0.6291666666666667 | 625.784 |
| 0.6298611111111111 | 621.613 |
| 0.6305555555555555 | 617.436 |
| 0.63125 | 609.062 |
| 0.6319444444444444 | 604.864 |
| 0.6326388888888889 | 600.661 |
| 0.6333333333333333 | 596.45 |
| 0.6340277777777777 | 588.009 |
| 0.6347222222222222 | 583.779 |
| 0.6354166666666666 | 575.299 |
| 0.6361111111111112 | 571.049 |
| 0.6368055555555555 | 566.793 |
| 0.6375000000000001 | 562.53 |
| 0.6381944444444444 | 558.261 |
| 0.638888888888889 | 549.704 |
| 0.6395833333333333 | 545.416 |
| 0.6402777777777778 | 541.121 |
| 0.6409722222222222 | 532.513 |
| 0.6416666666666667 | 528.2 |
| 0.642361111111111 | 523.88 |
| 0.6430555555555556 | 515.223 |
| 0.6437499999999999 | 506.542 |
| 0.6444444444444445 | 497.836 |
| 0.6451388888888888 | 493.475 |
| 0.6458333333333334 | 489.108 |
| 0.6465277777777778 | 480.356 |
| 0.6472222222222223 | 471.582 |
| 0.6479166666666667 | 462.786 |
| 0.6486111111111111 | 458.38 |
| 0.6493055555555556 | 453.968 |
| 0.65 | 445.129 |
| 0.6506944444444445 | 440.702 |
| 0.6513888888888889 | 431.833 |
| 0.6520833333333333 | 422.943 |
| 0.6527777777777778 | 418.492 |
| 0.6534722222222222 | 414.035 |
| 0.6541666666666667 | 405.108 |
| 0.6548611111111111 | 400.638 |
| 0.6555555555555556 | 396.164 |
| 0.65625 | 391.685 |
| 0.6569444444444444 | 387.202 |
| 0.6576388888888889 | 382.715 |
| 0.6583333333333333 | 373.729 |
| 0.6590277777777778 | 369.23 |
| 0.6597222222222222 | 364.728 |
| 0.6604166666666667 | 360.221 |
| 0.6611111111111111 | 355.712 |
| 0.6618055555555555 | 351.198 |
| 0.6625 | 346.682 |
| 0.6631944444444444 | 342.162 |
| 0.6638888888888889 | 337.639 |
| 0.6645833333333333 | 333.113 |
| 0.6652777777777777 | 328.584 |
| 0.6659722222222222 | 324.052 |
| 0.6666666666666666 | 319.517 |
| 0.6673611111111111 | 314.98 |
| 0.6680555555555556 | 310.44 |
| 0.6687500000000001 | 305.898 |
| 0.6694444444444444 | 305.898 |
| 0.6701388888888888 | 305.898 |
| 0.6708333333333334 | 301.354 |
| 0.6715277777777778 | 296.808 |
| 0.6722222222222222 | 292.259 |
| 0.6729166666666666 | 287.709 |
| 0.6736111111111112 | 287.709 |
| 0.6743055555555556 | 283.156 |
| 0.6749999999999999 | 278.603 |
| 0.6756944444444444 | 274.047 |
| 0.6763888888888889 | 269.49 |
| 0.6770833333333334 | 264.932 |
| 0.6777777777777777 | 260.373 |
| 0.6784722222222223 | 260.373 |
| 0.6791666666666667 | 255.813 |
| 0.6798611111111111 | 251.251 |
| 0.6805555555555555 | 251.251 |
| 0.68125 | 246.689 |
| 0.6819444444444445 | 242.127 |
| 0.6826388888888889 | 237.564 |
| 0.6833333333333332 | 233 |
| 0.6840277777777778 | 233 |
| 0.6847222222222222 | 233 |
| 0.6854166666666667 | 228.436 |
| 0.686111111111111 | 223.873 |
| 0.6868055555555556 | 223.873 |
| 0.6875 | 219.309 |
| 0.6881944444444444 | 219.309 |
| 0.688888888888889 | 219.309 |
| 0.6895833333333333 | 214.746 |
| 0.6902777777777778 | 210.182 |
| 0.6909722222222222 | 210.182 |
| 0.6916666666666668 | 205.62 |
| 0.6923611111111111 | 205.62 |
| 0.6930555555555555 | 201.058 |
| 0.69375 | 201.058 |
| 0.6944444444444445 | 201.058 |
| 0.6951388888888889 | 196.497 |
| 0.6958333333333333 | 196.497 |
| 0.6965277777777777 | 191.937 |
| 0.6972222222222223 | 191.937 |
| 0.6979166666666666 | 191.937 |
| 0.6986111111111111 | 187.378 |
| 0.6993055555555556 | 187.378 |
| 0.7000000000000001 | 182.82 |
| 0.7006944444444444 | 182.82 |
| 0.7013888888888888 | 182.82 |
| 0.7020833333333334 | 182.82 |
| 0.7027777777777778 | 178.264 |
| 0.7034722222222222 | 178.264 |
| 0.7041666666666666 | 173.709 |
| 0.7048611111111112 | 173.709 |
| 0.7055555555555556 | 173.709 |
| 0.7062499999999999 | 169.156 |
| 0.7069444444444444 | 169.156 |
| 0.7076388888888889 | 164.605 |
| 0.7083333333333334 | 164.605 |
| 0.7090277777777777 | 155.509 |
| 0.7097222222222223 | 155.509 |
| 0.7104166666666667 | 150.964 |
| 0.7111111111111111 | 150.964 |
| 0.7118055555555555 | 146.423 |
| 0.7125 | 146.423 |
| 0.7131944444444445 | 146.423 |
| 0.7138888888888889 | 146.423 |
| 0.7145833333333332 | 146.423 |
| 0.7152777777777778 | 141.884 |
| 0.7159722222222222 | 141.884 |
| 0.7166666666666667 | 137.347 |
| 0.717361111111111 | 137.347 |
| 0.7180555555555556 | 137.347 |
| 0.71875 | 132.814 |
| 0.7194444444444444 | 132.814 |
| 0.720138888888889 | 132.814 |
| 0.7208333333333333 | 128.284 |
| 0.7215277777777778 | 128.284 |
| 0.7222222222222222 | 128.284 |
| 0.7229166666666668 | 123.758 |
| 0.7236111111111111 | 123.758 |
| 0.7243055555555555 | 123.758 |
| 0.725 | 123.758 |
| 0.7256944444444445 | 119.235 |
| 0.7263888888888889 | 119.235 |
| 0.7270833333333333 | 119.235 |
| 0.7277777777777777 | 119.235 |
| 0.7284722222222223 | 114.716 |
| 0.7291666666666666 | 110.201 |
| 0.7298611111111111 | 110.201 |
| 0.7305555555555556 | 105.69 |
| 0.7312500000000001 | 105.69 |
| 0.7319444444444444 | 101.184 |
| 0.7326388888888888 | 101.184 |
| 0.7333333333333334 | 96.682 |
| 0.7340277777777778 | 101.184 |
| 0.7347222222222222 | 101.184 |
| 0.7354166666666666 | 101.184 |
| 0.7361111111111112 | 101.184 |
| 0.7368055555555556 | 101.184 |
| 0.7374999999999999 | 96.682 |
| 0.7381944444444444 | 96.682 |
| 0.7388888888888889 | 96.682 |
| 0.7395833333333334 | 96.682 |
| 0.7402777777777777 | 96.682 |
| 0.7409722222222223 | 96.682 |
| 0.7416666666666667 | 96.682 |
| 0.7423611111111111 | 96.682 |
| 0.7430555555555555 | 92.184 |
| 0.74375 | 92.184 |
| 0.7444444444444445 | 92.184 |
| 0.7451388888888889 | 92.184 |
| 0.7458333333333332 | 87.692 |
| 0.7465277777777778 | 87.692 |
| 0.7472222222222222 | 87.692 |
| 0.7479166666666667 | 87.692 |
| 0.748611111111111 | 87.692 |
| 0.7493055555555556 | 83.205 |
| 0.75 | 83.205 |
| 0.7506944444444444 | 83.205 |
| 0.751388888888889 | 78.722 |
| 0.7520833333333333 | 78.722 |
| 0.7527777777777778 | 78.722 |
| 0.7534722222222222 | 74.246 |
| 0.7541666666666668 | 74.246 |
| 0.7548611111111111 | 74.246 |
| 0.7555555555555555 | 74.246 |
| 0.75625 | 69.775 |
| 0.7569444444444445 | 69.775 |
| 0.7576388888888889 | 69.775 |
| 0.7583333333333333 | 65.31 |
| 0.7590277777777777 | 65.31 |
| 0.7597222222222223 | 65.31 |
| 0.7604166666666666 | 60.85 |
| 0.7611111111111111 | 60.85 |
| 0.7618055555555556 | 60.85 |
| 0.7625000000000001 | 56.398 |
| 0.7631944444444444 | 56.398 |
| 0.7638888888888888 | 56.398 |
| 0.7645833333333334 | 51.951 |
| 0.7652777777777778 | 51.951 |
| 0.7659722222222222 | 51.951 |
| 0.7666666666666666 | 47.511 |
| 0.7673611111111112 | 47.511 |
| 0.7680555555555556 | 47.511 |
| 0.7687499999999999 | 43.079 |
| 0.7694444444444444 | 43.079 |
| 0.7701388888888889 | 38.653 |
| 0.7708333333333334 | 38.653 |
| 0.7715277777777777 | 38.653 |
| 0.7722222222222223 | 38.653 |
| 0.7729166666666667 | 34.234 |
| 0.7736111111111111 | 34.234 |
| 0.7743055555555555 | 34.234 |
| 0.775 | 29.823 |
| 0.7756944444444445 | 29.823 |
| 0.7763888888888889 | 29.823 |
| 0.7770833333333332 | 29.823 |
| 0.7777777777777778 | 25.419 |
| 0.7784722222222222 | 25.419 |
| 0.7791666666666667 | 25.419 |
| 0.779861111111111 | 25.419 |
| 0.7805555555555556 | 21.024 |
| 0.78125 | 21.024 |
| 0.7819444444444444 | 21.024 |
| 0.782638888888889 | 21.024 |
| 0.7833333333333333 | 21.024 |
| 0.7840277777777778 | 16.636 |
| 0.7847222222222222 | 16.636 |
| 0.7854166666666668 | 16.636 |
| 0.7861111111111111 | 16.636 |
| 0.7868055555555555 | 16.636 |
| 0.7875 | 12.257 |
| 0.7881944444444445 | 12.257 |
| 0.7888888888888889 | 12.257 |
| 0.7895833333333333 | 12.257 |
| 0.7902777777777777 | 12.257 |
| 0.7909722222222223 | 12.257 |
| 0.7916666666666666 | 12.257 |
| 0.7923611111111111 | 7.887 |
| 0.7930555555555556 | 7.887 |
| 0.7937500000000001 | 7.887 |
| 0.7944444444444444 | 7.887 |
| 0.7951388888888888 | 7.887 |
| 0.7958333333333334 | 7.887 |
| 0.7965277777777778 | 7.887 |
| 0.7972222222222222 | 3.525 |
| 0.7979166666666666 | 3.525 |
| 0.7986111111111112 | 3.525 |
| 0.7993055555555556 | 3.525 |
| 0.7999999999999999 | 3.525 |
| 0.8006944444444444 | 3.525 |
| 0.8013888888888889 | 3.525 |
| 0.8020833333333334 | 3.525 |
| 0.8027777777777777 | 0 |
| 0.8034722222222223 | 0 |
| 0.8041666666666667 | 0 |
| 0.8048611111111111 | 0 |
| 0.8055555555555555 | 0 |
| 0.80625 | 0 |
| 0.8069444444444445 | 0 |
| 0.8076388888888889 | 0 |
| 0.8083333333333332 | 0 |
| 0.8090277777777778 | 0 |
| 0.8097222222222222 | 0 |
| 0.8104166666666667 | 0 |
| 0.811111111111111 | 0 |
| 0.8118055555555556 | 0 |
| 0.8125 | 0 |
| 0.8131944444444444 | 0 |
| 0.813888888888889 | 0 |
| 0.8145833333333333 | 0 |
| 0.8152777777777778 | 0 |
| 0.8159722222222222 | 0 |
| 0.8166666666666668 | 0 |
| 0.8173611111111111 | 0 |
| 0.8180555555555555 | 0 |
| 0.81875 | 0 |
| 0.8194444444444445 | 0 |
| 0.8201388888888889 | 0 |
| 0.8208333333333333 | 0 |
| 0.8215277777777777 | 0 |
| 0.8222222222222223 | 0 |
| 0.8229166666666666 | 0 |
| 0.8236111111111111 | 0 |
| 0.8243055555555556 | 0 |
| 0.8250000000000001 | 0 |
| 0.8256944444444444 | 0 |
| 0.8263888888888888 | 0 |
| 0.8270833333333334 | 0 |
| 0.8277777777777778 | 0 |
| 0.8284722222222222 | 0 |
| 0.8291666666666666 | 0 |
| 0.8298611111111112 | 0 |
| 0.8305555555555556 | 0 |
| 0.8312499999999999 | 0 |
| 0.8319444444444444 | 0 |
| 0.8326388888888889 | 0 |
| 0.8333333333333334 | 0 |
| 0.8340277777777777 | 0 |
| 0.8347222222222223 | 0 |
| 0.8354166666666667 | 0 |
| 0.8361111111111111 | 0 |
| 0.8368055555555555 | 0 |
| 0.8375 | 0 |
| 0.8381944444444445 | 0 |
| 0.8388888888888889 | 0 |
| 0.8395833333333332 | 0 |
| 0.8402777777777778 | 0 |
| 0.8409722222222222 | 0 |
| 0.8416666666666667 | 0 |
| 0.842361111111111 | 0 |
| 0.8430555555555556 | 0 |
| 0.84375 | 0 |
| 0.8444444444444444 | 0 |
| 0.845138888888889 | 0 |
| 0.8458333333333333 | 0 |
| 0.8465277777777778 | 0 |
| 0.8472222222222222 | 0 |
| 0.8479166666666668 | 0 |
| 0.8486111111111111 | 0 |
| 0.8493055555555555 | 0 |
| 0.85 | 0 |
| 0.8506944444444445 | 0 |
| 0.8513888888888889 | 0 |
| 0.8520833333333333 | 0 |
| 0.8527777777777777 | 0 |
| 0.8534722222222223 | 0 |
| 0.8541666666666666 | 0 |
| 0.8548611111111111 | 0 |
| 0.8555555555555556 | 0 |
| 0.8562500000000001 | 0 |
| 0.8569444444444444 | 0 |
| 0.8576388888888888 | 0 |
| 0.8583333333333334 | 0 |
| 0.8590277777777778 | 0 |
| 0.8597222222222222 | 0 |
| 0.8604166666666666 | 0 |
| 0.8611111111111112 | 0 |
| 0.8618055555555556 | 0 |
| 0.8624999999999999 | 0 |
| 0.8631944444444444 | 0 |
| 0.8638888888888889 | 0 |
| 0.8645833333333334 | 0 |
| 0.8652777777777777 | 0 |
| 0.8659722222222223 | 0 |
| 0.8666666666666667 | 0 |
| 0.8673611111111111 | 0 |
| 0.8680555555555555 | 0 |
| 0.86875 | 0 |
| 0.8694444444444445 | 0 |
| 0.8701388888888889 | 0 |
| 0.8708333333333332 | 0 |
| 0.8715277777777778 | 0 |
| 0.8722222222222222 | 0 |
| 0.8729166666666667 | 0 |
| 0.873611111111111 | 0 |
| 0.8743055555555556 | 0 |
| 0.875 | 0 |
| 0.8756944444444444 | 0 |
| 0.876388888888889 | 0 |
| 0.8770833333333333 | 0 |
| 0.8777777777777778 | 0 |
| 0.8784722222222222 | 0 |
| 0.8791666666666668 | 0 |
| 0.8798611111111111 | 0 |
| 0.8805555555555555 | 0 |
| 0.88125 | 0 |
| 0.8819444444444445 | 0 |
| 0.8826388888888889 | 0 |
| 0.8833333333333333 | 0 |
| 0.8840277777777777 | 0 |
| 0.8847222222222223 | 0 |
| 0.8854166666666666 | 0 |
| 0.8861111111111111 | 0 |
| 0.8868055555555556 | 0 |
| 0.8875000000000001 | 0 |
| 0.8881944444444444 | 0 |
| 0.8888888888888888 | 0 |
| 0.8895833333333334 | 0 |
| 0.8902777777777778 | 0 |
| 0.8909722222222222 | 0 |
| 0.8916666666666666 | 0 |
| 0.8923611111111112 | 0 |
| 0.8930555555555556 | 0 |
| 0.8937499999999999 | 0 |
| 0.8944444444444444 | 0 |
| 0.8951388888888889 | 0 |
| 0.8958333333333334 | 0 |
| 0.8965277777777777 | 0 |
| 0.8972222222222223 | 0 |
| 0.8979166666666667 | 0 |
| 0.8986111111111111 | 0 |
| 0.8993055555555555 | 0 |
| 0.9 | 0 |
| 0.9006944444444445 | 0 |
| 0.9013888888888889 | 0 |
| 0.9020833333333332 | 0 |
| 0.9027777777777778 | 0 |
| 0.9034722222222222 | 0 |
| 0.9041666666666667 | 0 |
| 0.904861111111111 | 0 |
| 0.9055555555555556 | 0 |
| 0.90625 | 0 |
| 0.9069444444444444 | 0 |
| 0.907638888888889 | 0 |
| 0.9083333333333333 | 0 |
| 0.9090277777777778 | 0 |
| 0.9097222222222222 | 0 |
| 0.9104166666666668 | 0 |
| 0.9111111111111111 | 0 |
| 0.9118055555555555 | 0 |
| 0.9125 | 0 |
| 0.9131944444444445 | 0 |
| 0.9138888888888889 | 0 |
| 0.9145833333333333 | 0 |
| 0.9152777777777777 | 0 |
| 0.9159722222222223 | 0 |
| 0.9166666666666666 | 0 |
| 0.9173611111111111 | 0 |
| 0.9180555555555556 | 0 |
| 0.9187500000000001 | 0 |
| 0.9194444444444444 | 0 |
| 0.9201388888888888 | 0 |
| 0.9208333333333334 | 0 |
| 0.9215277777777778 | 0 |
| 0.9222222222222222 | 0 |
| 0.9229166666666666 | 0 |
| 0.9236111111111112 | 0 |
| 0.9243055555555556 | 0 |
| 0.9249999999999999 | 0 |
| 0.9256944444444444 | 0 |
| 0.9263888888888889 | 0 |
| 0.9270833333333334 | 0 |
| 0.9277777777777777 | 0 |
| 0.9284722222222223 | 0 |
| 0.9291666666666667 | 0 |
| 0.9298611111111111 | 0 |
| 0.9305555555555555 | 0 |
| 0.93125 | 0 |
| 0.9319444444444445 | 0 |
| 0.9326388888888889 | 0 |
| 0.9333333333333332 | 0 |
| 0.9340277777777778 | 0 |
| 0.9347222222222222 | 0 |
| 0.9354166666666667 | 0 |
| 0.936111111111111 | 0 |
| 0.9368055555555556 | 0 |
| 0.9375 | 0 |
| 0.9381944444444444 | 0 |
| 0.938888888888889 | 0 |
| 0.9395833333333333 | 0 |
| 0.9402777777777778 | 0 |
| 0.9409722222222222 | 0 |
| 0.9416666666666668 | 0 |
| 0.9423611111111111 | 0 |
| 0.9430555555555555 | 0 |
| 0.94375 | 0 |
| 0.9444444444444445 | 0 |
| 0.9451388888888889 | 0 |
| 0.9458333333333333 | 0 |
| 0.9465277777777777 | 0 |
| 0.9472222222222223 | 0 |
| 0.9479166666666666 | 0 |
| 0.9486111111111111 | 0 |
| 0.9493055555555556 | 0 |
| 0.9500000000000001 | 0 |
| 0.9506944444444444 | 0 |
| 0.9513888888888888 | 0 |
| 0.9520833333333334 | 0 |
| 0.9527777777777778 | 0 |
| 0.9534722222222222 | 0 |
| 0.9541666666666666 | 0 |
| 0.9548611111111112 | 0 |
| 0.9555555555555556 | 0 |
| 0.9562499999999999 | 0 |
| 0.9569444444444444 | 0 |
| 0.9576388888888889 | 0 |
| 0.9583333333333334 | 0 |
| 0.9590277777777777 | 0 |
| 0.9597222222222223 | 0 |
| 0.9604166666666667 | 0 |
| 0.9611111111111111 | 0 |
| 0.9618055555555555 | 0 |
| 0.9625 | 0 |
| 0.9631944444444445 | 0 |
| 0.9638888888888889 | 0 |
| 0.9645833333333332 | 0 |
| 0.9652777777777778 | 0 |
| 0.9659722222222222 | 0 |
| 0.9666666666666667 | 0 |
| 0.967361111111111 | 0 |
| 0.9680555555555556 | 0 |
| 0.96875 | 0 |
| 0.9694444444444444 | 0 |
| 0.970138888888889 | 0 |
| 0.9708333333333333 | 0 |
| 0.9715277777777778 | 0 |
| 0.9722222222222222 | 0 |
| 0.9729166666666668 | 0 |
| 0.9736111111111111 | 0 |
| 0.9743055555555555 | 0 |
| 0.975 | 0 |
| 0.9756944444444445 | 0 |
| 0.9763888888888889 | 0 |
| 0.9770833333333333 | 0 |
| 0.9777777777777777 | 0 |
| 0.9784722222222223 | 0 |
| 0.9791666666666666 | 0 |
| 0.9798611111111111 | 0 |
| 0.9805555555555556 | 0 |
| 0.9812500000000001 | 0 |
| 0.9819444444444444 | 0 |
| 0.9826388888888888 | 0 |
| 0.9833333333333334 | 0 |
| 0.9840277777777778 | 0 |
| 0.9847222222222222 | 0 |
| 0.9854166666666666 | 0 |
| 0.9861111111111112 | 0 |
| 0.9868055555555556 | 0 |
| 0.9874999999999999 | 0 |
| 0.9881944444444444 | 0 |
| 0.9888888888888889 | 0 |
| 0.9895833333333334 | 0 |
| 0.9902777777777777 | 0 |
| 0.9909722222222223 | 0 |
| 0.9916666666666667 | 0 |
| 0.9923611111111111 | 0 |
| 0.9930555555555555 | 0 |
| 0.99375 | 0 |
| 0.9944444444444445 | 0 |
| 0.9951388888888889 | 0 |
| 0.9958333333333332 | 0 |
| 0.9965277777777778 | 0 |
| 0.9972222222222222 | 0 |
| 0.9979166666666667 | 0 |
| 0.998611111111111 | 0 |
| 0.9993055555555556 | 0 |